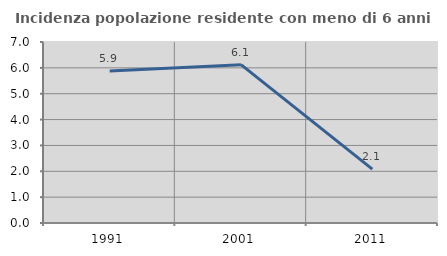
| Category | Incidenza popolazione residente con meno di 6 anni |
|---|---|
| 1991.0 | 5.882 |
| 2001.0 | 6.122 |
| 2011.0 | 2.083 |